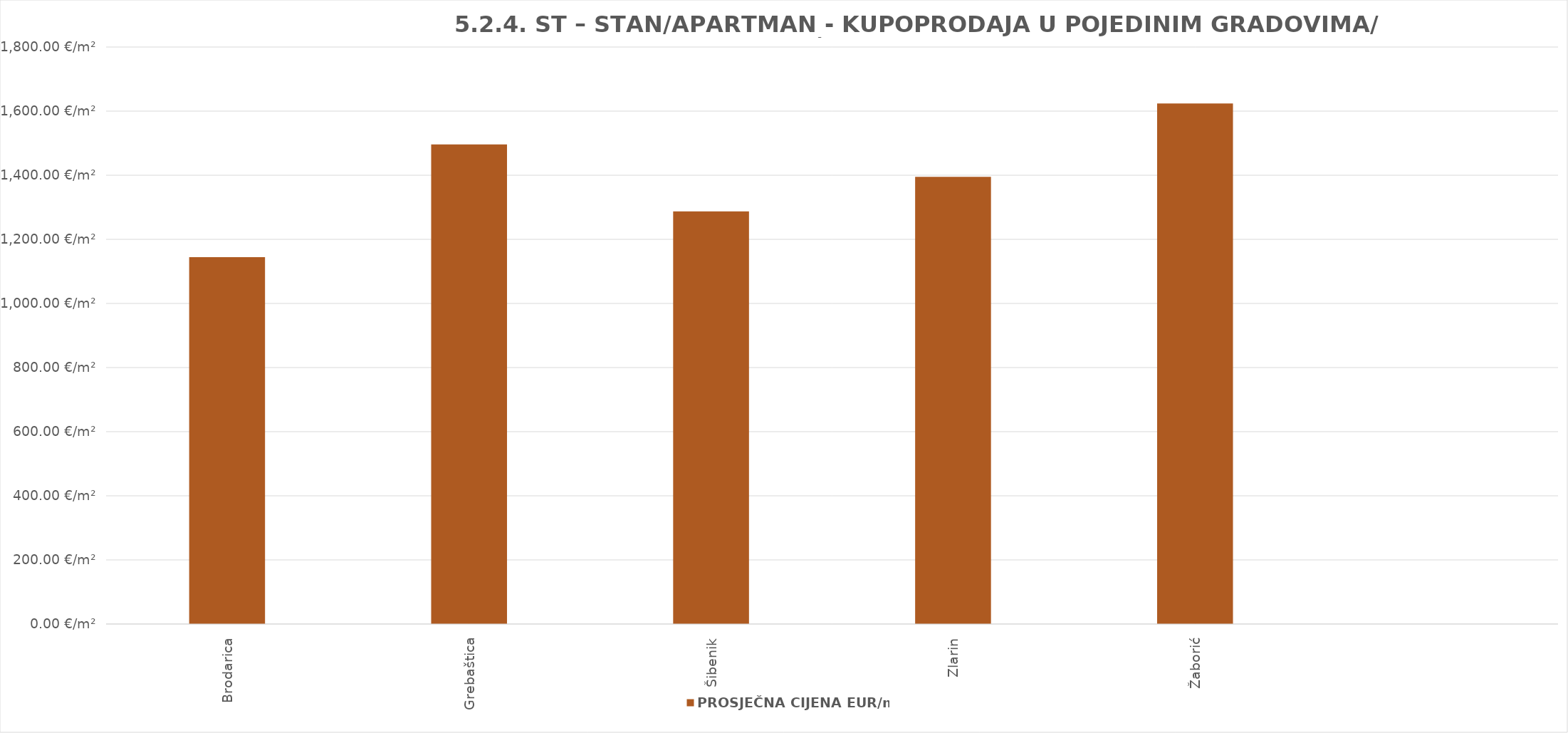
| Category | PROSJEČNA CIJENA EUR/m² |
|---|---|
| Brodarica | 1903-02-17 08:07:45 |
| Grebaštica | 1904-02-03 20:06:53 |
| Šibenik | 1903-07-10 09:07:40 |
| Zlarin | 1903-10-26 06:20:24 |
| Žaborić | 1904-06-10 18:34:49 |